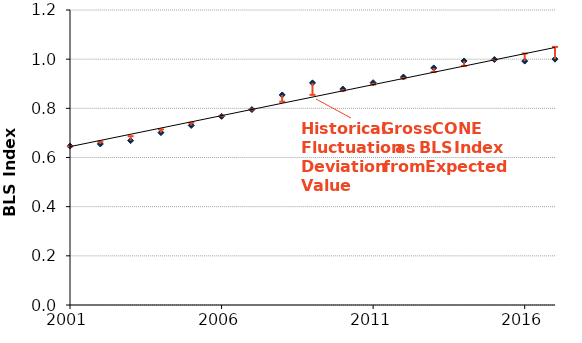
| Category | BLS Index Shocks |
|---|---|
| 2001.0 | 0.647 |
| 2002.0 | 0.655 |
| 2003.0 | 0.669 |
| 2004.0 | 0.701 |
| 2005.0 | 0.73 |
| 2006.0 | 0.767 |
| 2007.0 | 0.795 |
| 2008.0 | 0.854 |
| 2009.0 | 0.904 |
| 2010.0 | 0.878 |
| 2011.0 | 0.904 |
| 2012.0 | 0.927 |
| 2013.0 | 0.964 |
| 2014.0 | 0.993 |
| 2015.0 | 0.999 |
| 2016.0 | 0.992 |
| 2017.0 | 1 |